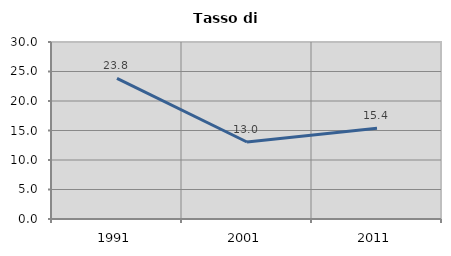
| Category | Tasso di disoccupazione   |
|---|---|
| 1991.0 | 23.825 |
| 2001.0 | 13.05 |
| 2011.0 | 15.378 |